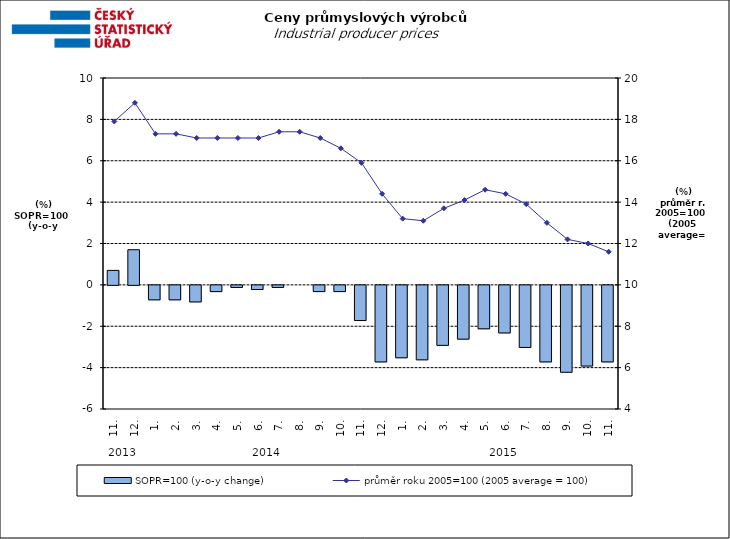
| Category | SOPR=100 (y-o-y change)   |
|---|---|
| 0 | 0.7 |
| 1 | 1.7 |
| 2 | -0.7 |
| 3 | -0.7 |
| 4 | -0.8 |
| 5 | -0.3 |
| 6 | -0.1 |
| 7 | -0.2 |
| 8 | -0.1 |
| 9 | 0 |
| 10 | -0.3 |
| 11 | -0.3 |
| 12 | -1.7 |
| 13 | -3.7 |
| 14 | -3.5 |
| 15 | -3.6 |
| 16 | -2.9 |
| 17 | -2.6 |
| 18 | -2.1 |
| 19 | -2.3 |
| 20 | -3 |
| 21 | -3.7 |
| 22 | -4.2 |
| 23 | -3.9 |
| 24 | -3.7 |